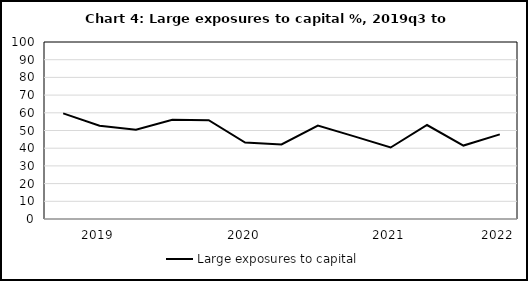
| Category | Large exposures to capital |
|---|---|
| nan | 59.7 |
| 2019.0 | 52.7 |
| nan | 50.4 |
| nan | 56.1 |
| nan | 55.8 |
| 2020.0 | 43.2 |
| nan | 42.1 |
| nan | 52.8 |
| nan | 46.7 |
| 2021.0 | 40.4 |
| nan | 53.1 |
| nan | 41.5 |
| 2022.0 | 47.8 |